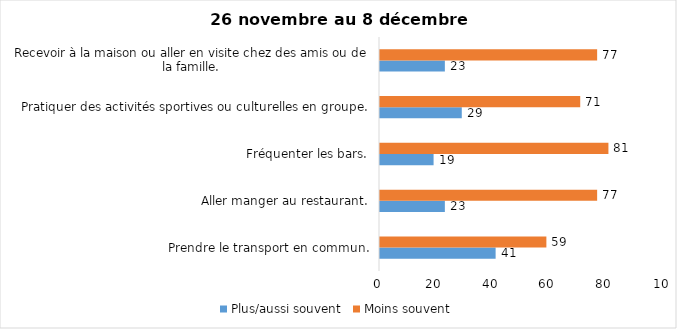
| Category | Plus/aussi souvent | Moins souvent |
|---|---|---|
| Prendre le transport en commun. | 41 | 59 |
| Aller manger au restaurant. | 23 | 77 |
| Fréquenter les bars. | 19 | 81 |
| Pratiquer des activités sportives ou culturelles en groupe. | 29 | 71 |
| Recevoir à la maison ou aller en visite chez des amis ou de la famille. | 23 | 77 |